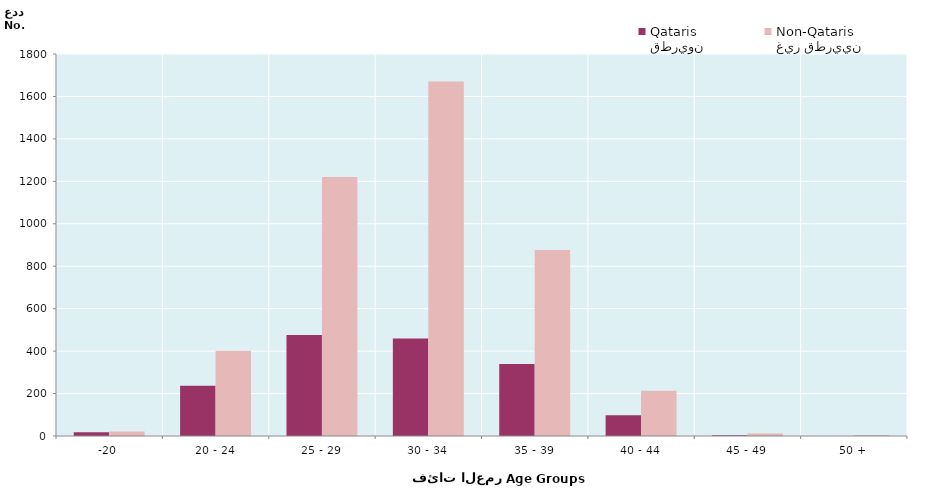
| Category | قطريون
Qataris | غير قطريين
Non-Qataris |
|---|---|---|
| -20 | 18 | 21 |
| 20 - 24 | 237 | 402 |
| 25 - 29 | 476 | 1221 |
| 30 - 34 | 459 | 1671 |
| 35 - 39 | 339 | 876 |
| 40 - 44 | 98 | 213 |
| 45 - 49 | 4 | 12 |
| 50 + | 0 | 5 |